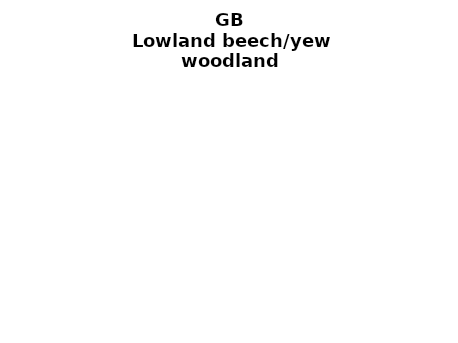
| Category | Lowland beech/yew woodland |
|---|---|
| <5 ha | 0.151 |
| ≥5 and <10 ha | 0.064 |
| ≥10 and <15 ha | 0.053 |
| ≥15 and <20 ha | 0.051 |
| ≥20 and <25 ha | 0.031 |
| ≥25 and <30 ha | 0.013 |
| ≥30 and <35 ha | 0.033 |
| ≥35 and <40 ha | 0.031 |
| ≥40 and <45 ha | 0.003 |
| ≥45 and <50 ha | 0.022 |
| ≥50 and <60 ha | 0.042 |
| ≥60 and <70 ha | 0.036 |
| ≥70 and <80 ha | 0.035 |
| ≥80 and <90 ha | 0.011 |
| ≥90 and <100 ha | 0.023 |
| ≥100 and <150 ha | 0.11 |
| ≥150 and <200 ha | 0.058 |
| ≥200 ha | 0.232 |